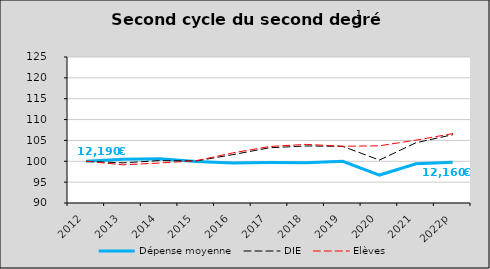
| Category | Dépense moyenne  | DIE  | Elèves |
|---|---|---|---|
| 2012 | 100 | 100 | 100 |
| 2013 | 100.477 | 99.624 | 99.151 |
| 2014 | 100.589 | 100.168 | 99.582 |
| 2015 | 99.942 | 100.08 | 100.138 |
| 2016 | 99.593 | 101.598 | 102.013 |
| 2017 | 99.707 | 103.241 | 103.544 |
| 2018 | 99.64 | 103.679 | 104.054 |
| 2019 | 99.99 | 103.581 | 103.591 |
| 2020 | 96.699 | 100.286 | 103.71 |
| 2021 | 99.409 | 104.455 | 105.075 |
| 2022p | 99.76 | 106.373 | 106.629 |